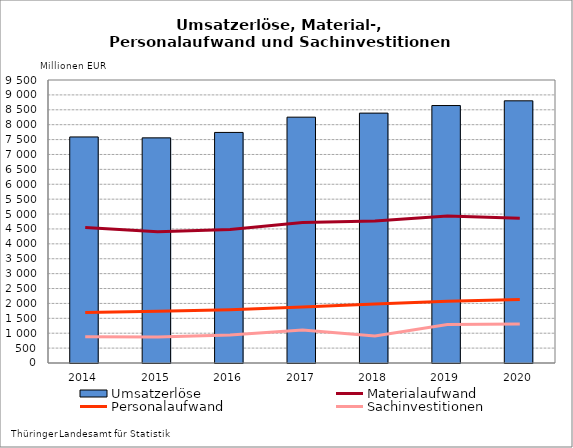
| Category | Umsatzerlöse |
|---|---|
| 2014.0 | 7588.59 |
| 2015.0 | 7557.268 |
| 2016.0 | 7740.227 |
| 2017.0 | 8252.208 |
| 2018.0 | 8388.485 |
| 2019.0 | 8642.783 |
| 2020.0 | 8801.101 |